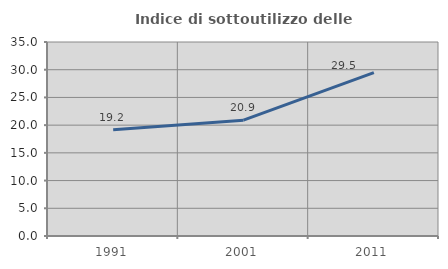
| Category | Indice di sottoutilizzo delle abitazioni  |
|---|---|
| 1991.0 | 19.182 |
| 2001.0 | 20.896 |
| 2011.0 | 29.481 |